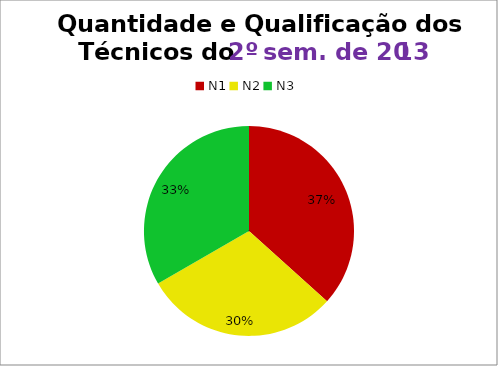
| Category | 2º/13 |
|---|---|
| N1 | 11 |
| N2 | 9 |
| N3 | 10 |